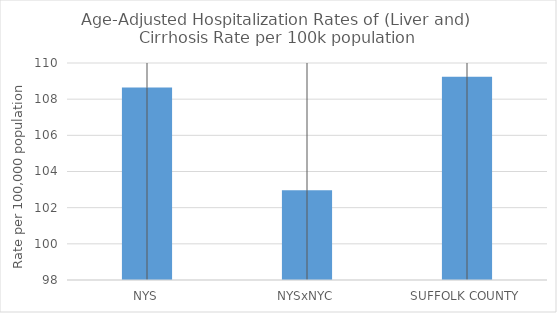
| Category | Age-Adjusted Hospitalization Rates of (Liver and) Cirrhosis Rate per 100k population |
|---|---|
| NYS | 108.64 |
| NYSxNYC | 102.966 |
| SUFFOLK COUNTY | 109.233 |